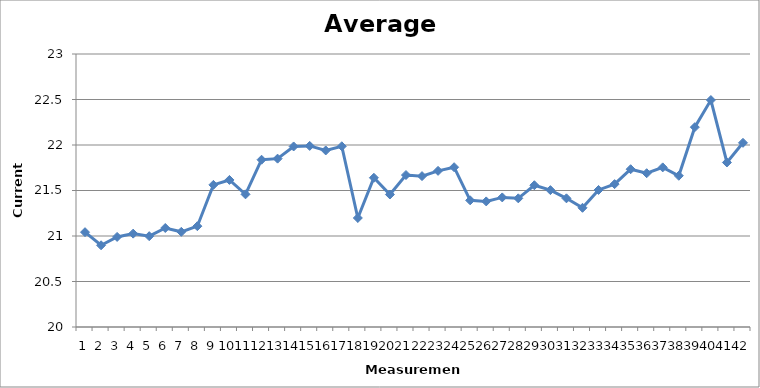
| Category | Average [pA] |
|---|---|
| 0 | 21.042 |
| 1 | 20.898 |
| 2 | 20.99 |
| 3 | 21.026 |
| 4 | 20.998 |
| 5 | 21.088 |
| 6 | 21.046 |
| 7 | 21.108 |
| 8 | 21.562 |
| 9 | 21.616 |
| 10 | 21.458 |
| 11 | 21.838 |
| 12 | 21.85 |
| 13 | 21.984 |
| 14 | 21.99 |
| 15 | 21.94 |
| 16 | 21.986 |
| 17 | 21.198 |
| 18 | 21.64 |
| 19 | 21.456 |
| 20 | 21.67 |
| 21 | 21.658 |
| 22 | 21.716 |
| 23 | 21.756 |
| 24 | 21.392 |
| 25 | 21.38 |
| 26 | 21.424 |
| 27 | 21.414 |
| 28 | 21.558 |
| 29 | 21.504 |
| 30 | 21.414 |
| 31 | 21.31 |
| 32 | 21.506 |
| 33 | 21.57 |
| 34 | 21.734 |
| 35 | 21.69 |
| 36 | 21.754 |
| 37 | 21.662 |
| 38 | 22.196 |
| 39 | 22.494 |
| 40 | 21.808 |
| 41 | 22.024 |